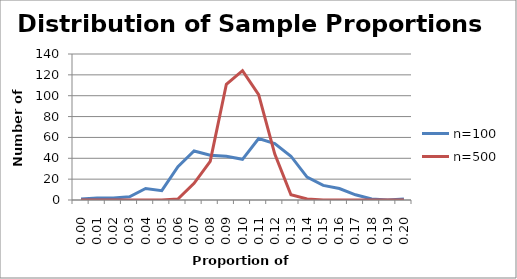
| Category | n=100 | n=500 |
|---|---|---|
| 0.0 | 1 | 0 |
| 0.01 | 2 | 0 |
| 0.02 | 2 | 0 |
| 0.03 | 3 | 0 |
| 0.04 | 11 | 0 |
| 0.05 | 9 | 0 |
| 0.06 | 32 | 1 |
| 0.07 | 47 | 16 |
| 0.08 | 43 | 37 |
| 0.09 | 42 | 111 |
| 0.1 | 39 | 124 |
| 0.11 | 59 | 101 |
| 0.12 | 54 | 44 |
| 0.13 | 42 | 5 |
| 0.14 | 22 | 1 |
| 0.15 | 14 | 0 |
| 0.16 | 11 | 0 |
| 0.17 | 5 | 0 |
| 0.18 | 1 | 0 |
| 0.19 | 0 | 0 |
| 0.2 | 1 | 0 |